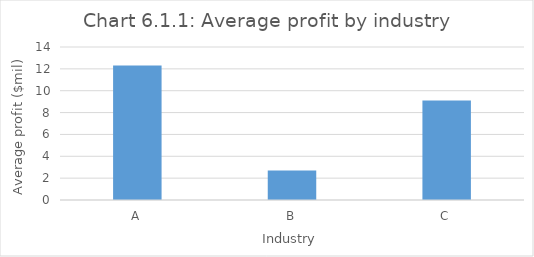
| Category | Average profit ($mil) |
|---|---|
| A | 12.3 |
| B | 2.7 |
| C | 9.1 |